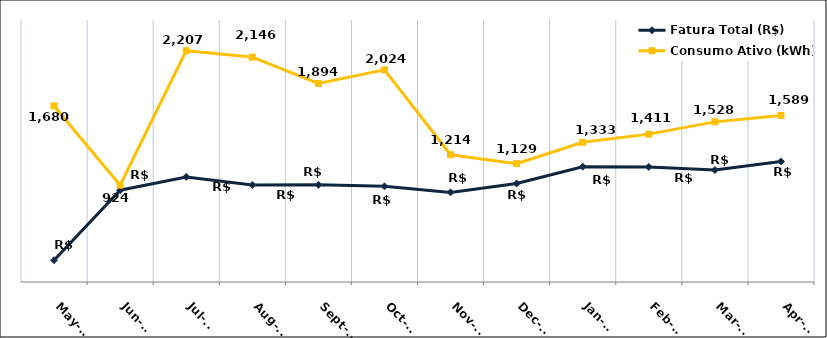
| Category | Fatura Total (R$) | Consumo Ativo (kWh) |
|---|---|---|
| 2023-05-01 | 207.94 | 1680 |
| 2023-06-01 | 875.59 | 924 |
| 2023-07-01 | 1002.66 | 2207 |
| 2023-08-01 | 925.8 | 2146 |
| 2023-09-01 | 927.46 | 1894 |
| 2023-10-01 | 912.66 | 2024 |
| 2023-11-01 | 855.21 | 1214 |
| 2023-12-01 | 940.06 | 1129 |
| 2024-01-01 | 1100.39 | 1333 |
| 2024-02-01 | 1097.95 | 1411 |
| 2024-03-01 | 1068.29 | 1528 |
| 2024-04-01 | 1150.73 | 1589 |